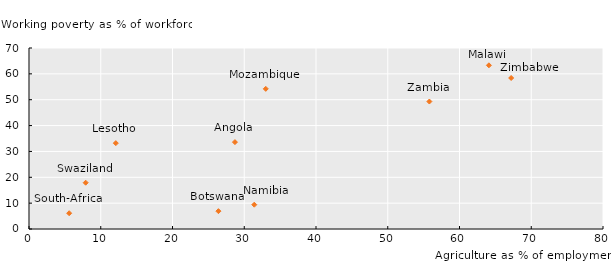
| Category | Working poverty |
|---|---|
| 28.7 | 33.6 |
| 26.4 | 6.9 |
| 12.1 | 33.2 |
| 64.1 | 63.3 |
| 33.0 | 54.2 |
| 31.4 | 9.4 |
| 5.6 | 6.1 |
| 7.9 | 17.9 |
| 55.8 | 49.3 |
| 67.2 | 58.4 |